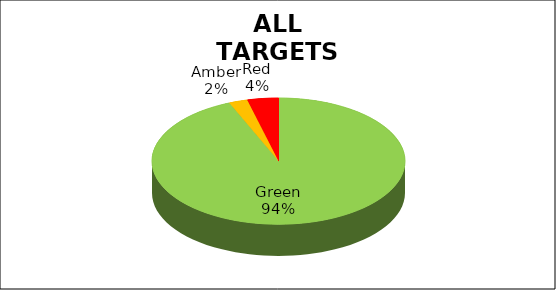
| Category | Series 0 |
|---|---|
| Green | 0.937 |
| Amber | 0.024 |
| Red | 0.04 |